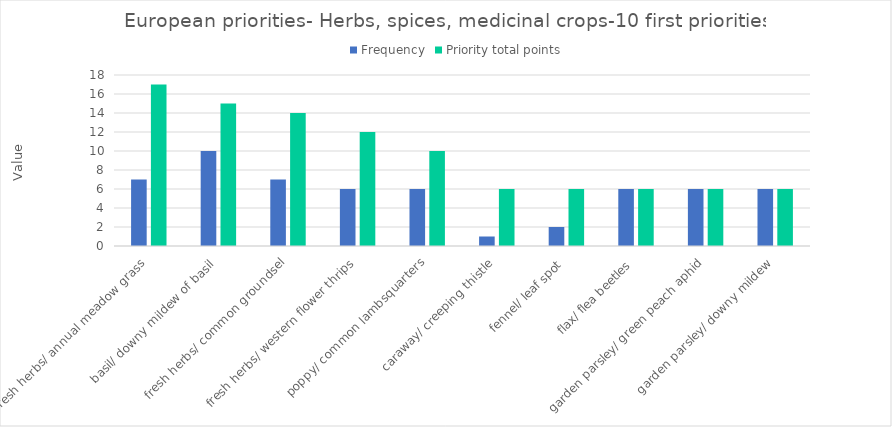
| Category | Frequency | Priority total points |
|---|---|---|
| fresh herbs/ annual meadow grass | 7 | 17 |
| basil/ downy mildew of basil | 10 | 15 |
| fresh herbs/ common groundsel | 7 | 14 |
| fresh herbs/ western flower thrips | 6 | 12 |
| poppy/ common lambsquarters | 6 | 10 |
| caraway/ creeping thistle | 1 | 6 |
| fennel/ leaf spot | 2 | 6 |
| flax/ flea beetles | 6 | 6 |
| garden parsley/ green peach aphid | 6 | 6 |
| garden parsley/ downy mildew | 6 | 6 |